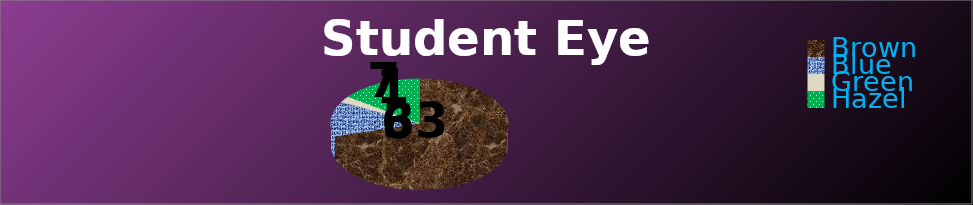
| Category | Series 0 |
|---|---|
| Brown | 33 |
| Blue | 6 |
| Green | 1 |
| Hazel | 7 |